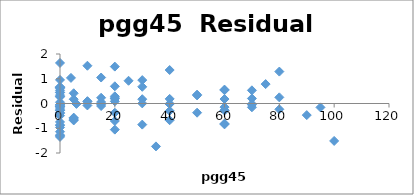
| Category | Series 0 |
|---|---|
| 0.0 | -1.305 |
| 0.0 | -0.887 |
| 20.0 | -0.706 |
| 0.0 | -0.747 |
| 0.0 | -1.35 |
| 0.0 | -0.042 |
| 0.0 | -1.141 |
| 0.0 | -1.273 |
| 0.0 | -0.12 |
| 0.0 | -0.259 |
| 0.0 | -0.182 |
| 0.0 | 0.437 |
| 30.0 | -0.853 |
| 5.0 | -0.572 |
| 5.0 | -0.659 |
| 0.0 | -0.491 |
| 30.0 | 0.173 |
| 0.0 | -0.966 |
| 0.0 | 0.27 |
| 0.0 | -0.135 |
| 0.0 | -0.368 |
| 20.0 | -1.055 |
| 0.0 | 0.639 |
| 60.0 | -0.843 |
| 0.0 | -0.064 |
| 0.0 | -0.286 |
| 70.0 | -0.153 |
| 20.0 | 0.194 |
| 80.0 | -0.235 |
| 0.0 | -0.399 |
| 0.0 | -0.06 |
| 0.0 | -0.867 |
| 0.0 | 0.051 |
| 0.0 | 0.653 |
| 0.0 | 0.953 |
| 5.0 | -0.685 |
| 15.0 | 0.232 |
| 15.0 | 1.05 |
| 35.0 | -1.733 |
| 5.0 | 0.414 |
| 80.0 | 0.248 |
| 10.0 | 0.094 |
| 0.0 | 0.277 |
| 6.0 | -0.017 |
| 20.0 | 0.087 |
| 15.0 | -0.033 |
| 100.0 | -1.512 |
| 40.0 | -0.008 |
| 0.0 | -0.117 |
| 0.0 | 0.456 |
| 50.0 | 0.327 |
| 0.0 | -0.273 |
| 70.0 | 0.532 |
| 40.0 | -0.298 |
| 5.0 | -0.592 |
| 15.0 | -0.101 |
| 4.0 | 1.035 |
| 0.0 | 0.535 |
| 20.0 | 0.695 |
| 40.0 | 0.186 |
| 0.0 | 0.615 |
| 40.0 | -0.677 |
| 95.0 | -0.157 |
| 60.0 | -0.812 |
| 0.0 | 0.337 |
| 20.0 | 0.223 |
| 70.0 | -0.048 |
| 10.0 | -0.078 |
| 0.0 | 1.638 |
| 5.0 | 0.172 |
| 60.0 | -0.271 |
| 25.0 | 0.918 |
| 20.0 | 0.29 |
| 90.0 | -0.469 |
| 20.0 | -0.372 |
| 50.0 | -0.371 |
| 60.0 | 0.18 |
| 10.0 | 0.073 |
| 70.0 | -0.017 |
| 50.0 | 0.357 |
| 40.0 | 1.352 |
| 60.0 | 0.538 |
| 30.0 | 0.004 |
| 70.0 | 0.204 |
| 30.0 | 0.946 |
| 60.0 | -0.279 |
| 0.0 | 0.673 |
| 30.0 | 0.675 |
| 60.0 | -0.146 |
| 75.0 | 0.784 |
| 0.0 | 0.657 |
| 15.0 | 0.059 |
| 60.0 | 0.562 |
| 40.0 | -0.021 |
| 10.0 | 1.526 |
| 80.0 | 1.29 |
| 20.0 | 1.491 |